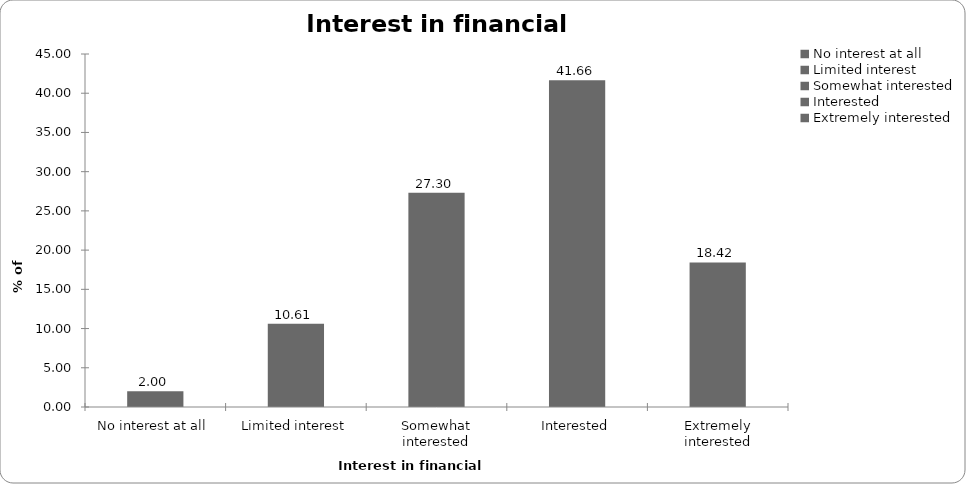
| Category | Interest in financial planning |
|---|---|
| No interest at all | 2.003 |
| Limited interest | 10.614 |
| Somewhat interested | 27.303 |
| Interested | 41.656 |
| Extremely interested | 18.425 |